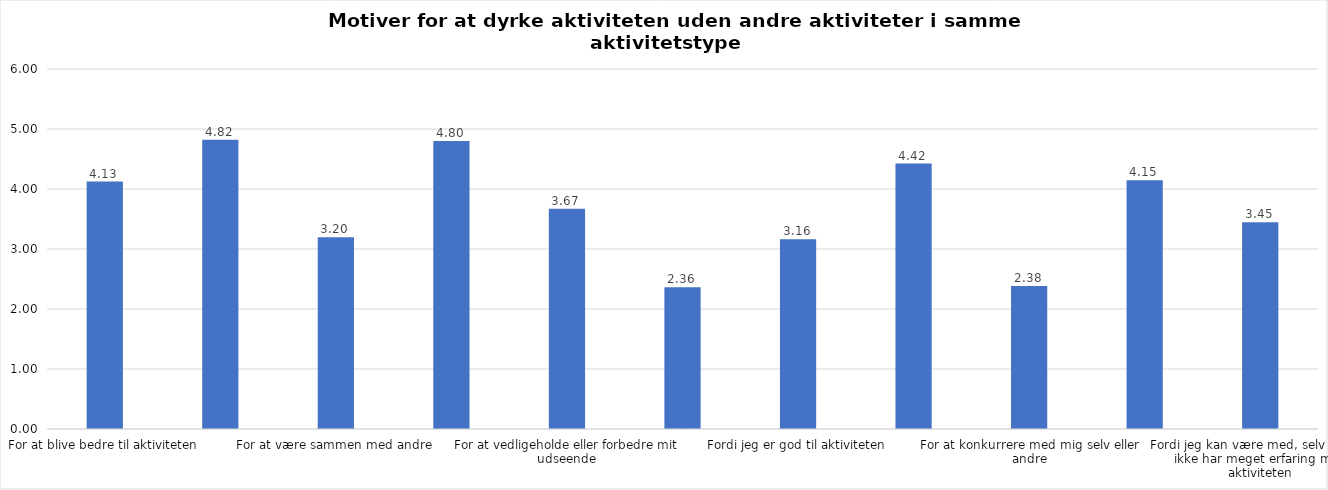
| Category | Gennemsnit |
|---|---|
| For at blive bedre til aktiviteten | 4.125 |
| For at vedligeholde eller forbedre min sundhed (fx helbred, fysisk form) | 4.82 |
| For at være sammen med andre | 3.196 |
| For at gøre noget godt for mig selv | 4.799 |
| For at vedligeholde eller forbedre mit udseende | 3.669 |
| Fordi andre i min omgangskreds opmuntrer mig til det | 2.361 |
| Fordi jeg er god til aktiviteten | 3.162 |
| Fordi jeg godt kan lide aktiviteten | 4.425 |
| For at konkurrere med mig selv eller andre | 2.383 |
| Fordi aktiviteten passer godt ind i min hverdag | 4.147 |
| Fordi jeg kan være med, selv om jeg ikke har meget erfaring med aktiviteten | 3.446 |